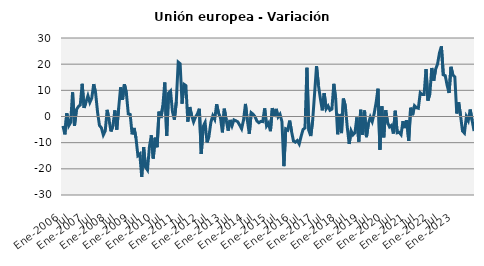
| Category | Series 0 |
|---|---|
| Ene-2006 | -3.598 |
|  | -6.823 |
|  | 1.21 |
|  | -3.545 |
|  | -2.253 |
|  | 9.227 |
| Jul | -3.546 |
|  | 2.603 |
|  | 3.752 |
|  | 4.418 |
|  | 12.491 |
|  | 3.272 |
| Ene-2007 | 5.566 |
|  | 7.921 |
|  | 5.372 |
|  | 7.06 |
|  | 12.367 |
|  | 8.924 |
| Jul | 1.762 |
|  | -3.418 |
|  | -4.314 |
|  | -7.055 |
|  | -5.565 |
|  | 2.536 |
| Ene-2008 | -1.308 |
|  | -5.708 |
|  | -3.623 |
|  | 2.32 |
|  | -4.995 |
|  | 3.158 |
| Jul | 11.158 |
|  | 6.391 |
|  | 12.335 |
|  | 9.037 |
|  | 1.015 |
|  | 0.778 |
| Ene-2009 | -6.809 |
|  | -4.388 |
|  | -8.115 |
|  | -14.938 |
|  | -14.314 |
|  | -23.087 |
| Jul | -11.728 |
|  | -19.353 |
|  | -20.448 |
|  | -11.681 |
|  | -7.174 |
|  | -16.051 |
| Ene-2010 | -8.093 |
|  | -11.736 |
|  | 1.841 |
|  | -0.573 |
|  | 4.109 |
|  | 13.015 |
| Jul | -7.387 |
|  | 8.996 |
|  | 9.775 |
|  | 1.892 |
|  | -1.213 |
|  | 5.661 |
| Ene-2011 | 20.755 |
|  | 20.133 |
|  | 4.904 |
|  | 12.312 |
|  | 11.806 |
|  | -1.954 |
| Jul | 3.615 |
|  | 0.306 |
|  | -2.071 |
|  | -0.204 |
|  | 0.984 |
|  | 2.951 |
| Ene-2012 | -14.337 |
|  | -3.785 |
|  | -2.285 |
|  | -9.882 |
|  | -7.53 |
|  | -2.226 |
| Jul | 0.316 |
|  | -1.084 |
|  | 4.694 |
|  | 1.316 |
|  | -0.431 |
|  | -6.055 |
| Ene-2013 | 2.974 |
|  | -1.466 |
|  | -5.41 |
|  | -1.323 |
|  | -3.555 |
|  | -1.279 |
| Jul | -1.636 |
|  | -2.013 |
|  | -3.314 |
|  | -4.685 |
|  | -1.379 |
|  | 4.805 |
| Ene-2014 | -1.486 |
|  | -6.602 |
|  | 1.449 |
|  | 0.828 |
|  | -0.078 |
|  | -1.765 |
| Jul | -2.39 |
|  | -1.873 |
|  | -1.955 |
|  | 3.096 |
|  | -3.622 |
|  | -2.52 |
| Ene-2015 | -5.609 |
|  | 3.21 |
|  | -0.152 |
|  | 2.902 |
|  | -0.171 |
|  | 0.88 |
| Jul | -1.963 |
|  | -18.975 |
|  | -4.737 |
|  | -5.19 |
|  | -1.573 |
|  | -5.7 |
| Ene-2016 | -9.35 |
|  | -9.825 |
|  | -9.191 |
|  | -10.496 |
|  | -7.501 |
|  | -4.946 |
| Jul | -4.375 |
|  | 18.613 |
|  | -5.342 |
|  | -7.464 |
|  | -1.388 |
|  | 8.803 |
| Ene-2017 | 19.236 |
|  | 11.882 |
|  | 6.846 |
|  | 2.35 |
|  | 8.901 |
|  | 2.927 |
| Jul | 4.033 |
|  | 2.394 |
|  | 2.834 |
|  | 12.488 |
|  | 6.583 |
|  | -6.799 |
| Ene-2018 | 0.98 |
|  | -6.327 |
|  | 6.841 |
|  | 4.067 |
|  | -4.038 |
|  | -10.487 |
| Jul | -5.448 |
|  | -6.999 |
|  | -6.206 |
|  | -0.371 |
|  | -9.611 |
|  | 2.579 |
| Ene-2019 | -6.963 |
|  | 2.257 |
|  | -7.89 |
|  | -2.703 |
|  | -0.244 |
|  | -1.966 |
| Jul | 1.09 |
|  | 5.213 |
|  | 10.632 |
|  | -12.694 |
|  | 3.903 |
|  | -7.949 |
| Ene-2020 | 2.385 |
|  | -2.291 |
|  | -3.989 |
|  | -3.392 |
|  | -6.514 |
|  | 2.194 |
| Jul | -6.222 |
|  | -6.024 |
|  | -6.94 |
|  | -1.77 |
|  | -4.425 |
|  | -1.444 |
| Ene-2021 | -9.299 |
|  | 3.354 |
|  | 0.5 |
|  | 4.1 |
|  | 3.379 |
|  | 3.146 |
| Jul | 9.07 |
|  | 8.383 |
|  | 8.402 |
|  | 18.131 |
|  | 6.089 |
|  | 8.698 |
| Ene-2022 | 18.547 |
|  | 13.692 |
|  | 18.063 |
|  | 20.031 |
|  | 24.311 |
|  | 26.793 |
| Jul | 15.911 |
|  | 15.625 |
|  | 11.897 |
|  | 8.978 |
|  | 18.977 |
|  | 15.835 |
| Ene-2023 | 15.127 |